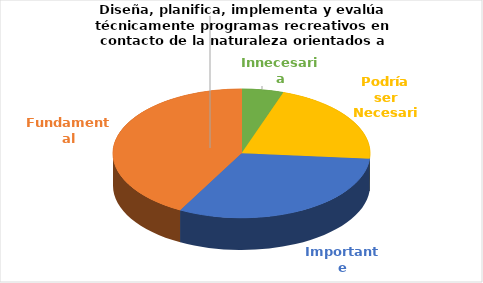
| Category | Series 0 |
|---|---|
| Innecesaria | 1 |
| Podría ser Necesaria | 4 |
| Importante | 6 |
| Fundamental | 8 |